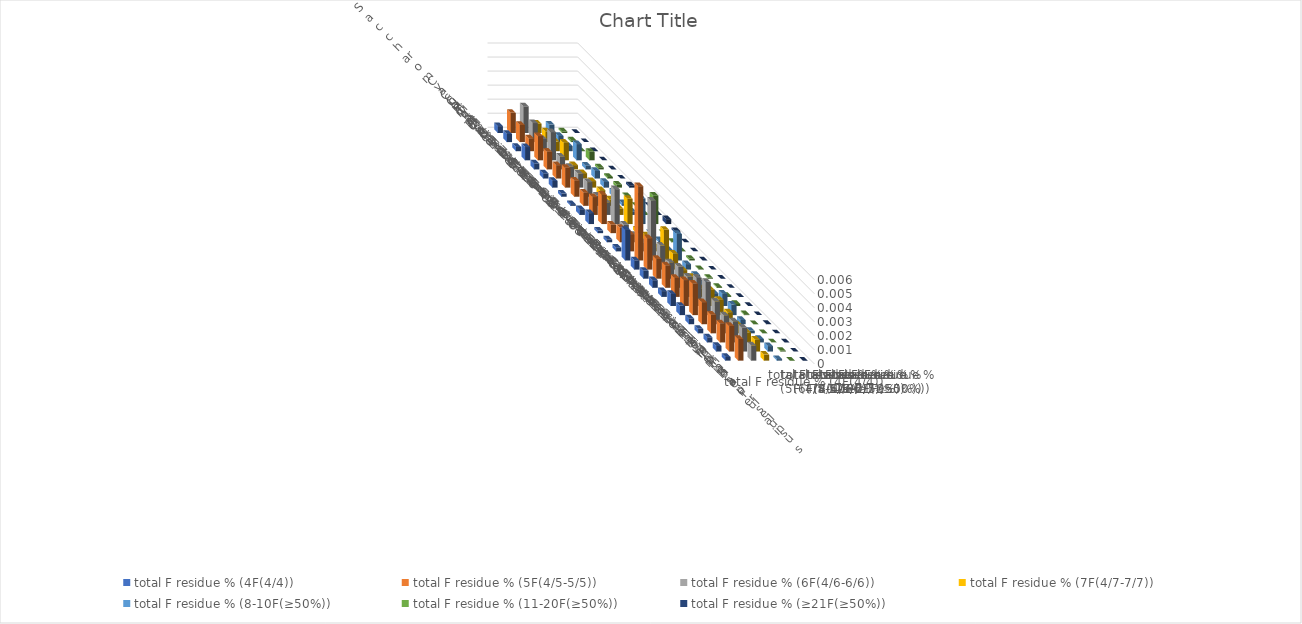
| Category | total F residue % (4F(4/4)) | total F residue % (5F(4/5-5/5)) | total F residue % (6F(4/6-6/6)) | total F residue % (7F(4/7-7/7)) | total F residue % (8-10F(≥50%)) | total F residue % (11-20F(≥50%)) | total F residue % (≥21F(≥50%)) |
|---|---|---|---|---|---|---|---|
| Saccharomyces cerevisiae S288c | 0 | 0.001 | 0.002 | 0.001 | 0.001 | 0 | 0 |
| Candida albicans | 0.001 | 0.001 | 0.001 | 0.001 | 0 | 0 | 0 |
| Candida auris | 0 | 0.001 | 0.001 | 0.001 | 0 | 0 | 0 |
| Candida tropicalis | 0.001 | 0.002 | 0.002 | 0.001 | 0.001 | 0.001 | 0 |
| Neurospora crassa | 0 | 0.001 | 0.001 | 0 | 0 | 0 | 0 |
| Magnaporthe oryzae | 0 | 0.001 | 0.001 | 0 | 0.001 | 0 | 0 |
| Trichoderma reesei | 0 | 0.001 | 0.001 | 0 | 0 | 0 | 0 |
| Cryptococcus neoformans | 0 | 0.001 | 0.001 | 0 | 0 | 0 | 0 |
| Ustilago maydis | 0 | 0.001 | 0.001 | 0 | 0 | 0 | 0 |
| Taiwanofungus camphoratus | 0 | 0.001 | 0.001 | 0 | 0 | 0 | 0 |
| Dictyostelium discoideum | 0.001 | 0.002 | 0.002 | 0.002 | 0.002 | 0.002 | 0 |
| Chlamydomonas reinhardtii | 0 | 0.001 | 0.001 | 0 | 0 | 0 | 0 |
| Drosophila melanogaster | 0 | 0.001 | 0.001 | 0 | 0 | 0 | 0 |
| Aedes aegypti | 0 | 0.001 | 0.001 | 0 | 0 | 0 | 0 |
| Plasmodium falciparum | 0.002 | 0.005 | 0.004 | 0.002 | 0.002 | 0 | 0 |
| Caenorhabditis elegans | 0.001 | 0.002 | 0.002 | 0.001 | 0 | 0 | 0 |
| Danio rerio | 0.001 | 0.001 | 0.001 | 0.001 | 0 | 0 | 0 |
| Mus musculus | 0.001 | 0.002 | 0.002 | 0.001 | 0 | 0 | 0 |
| Homo sapiens | 0 | 0.001 | 0.001 | 0.001 | 0 | 0 | 0 |
| Arabidopsis thaliana | 0.001 | 0.002 | 0.002 | 0.001 | 0.001 | 0 | 0 |
| Tetrahymena thermophila | 0.001 | 0.002 | 0.002 | 0.001 | 0.001 | 0 | 0 |
| Paramecium tetraurelia | 0 | 0.002 | 0.002 | 0.001 | 0 | 0 | 0 |
| Oxytricha trifallax | 0 | 0.001 | 0.001 | 0.001 | 0 | 0 | 0 |
| Stylonychia lemnae | 0 | 0.001 | 0.001 | 0.001 | 0 | 0 | 0 |
| Pseudocohnilembus persalinus | 0 | 0.002 | 0.002 | 0.001 | 0 | 0 | 0 |
| Stentor coeruleus | 0 | 0.002 | 0.001 | 0 | 0 | 0 | 0 |